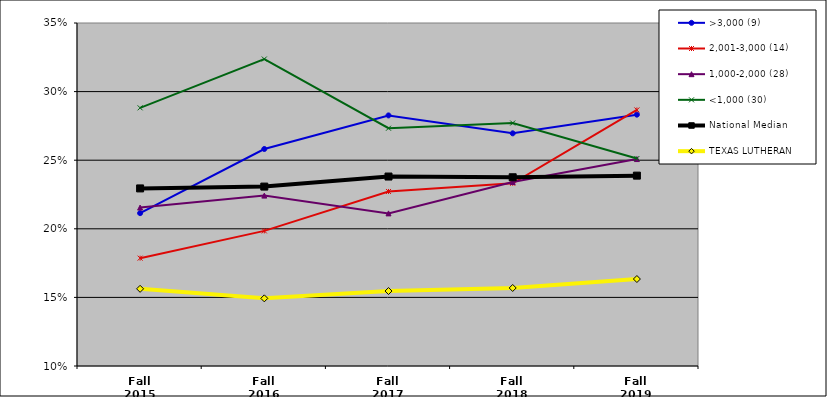
| Category | >3,000 (9) | 2,001-3,000 (14) | 1,000-2,000 (28) | <1,000 (30) | National Median | TEXAS LUTHERAN |
|---|---|---|---|---|---|---|
| Fall 2015 | 0.211 | 0.179 | 0.215 | 0.288 | 0.229 | 0.156 |
| Fall 2016 | 0.258 | 0.198 | 0.224 | 0.324 | 0.231 | 0.149 |
| Fall 2017 | 0.283 | 0.227 | 0.211 | 0.273 | 0.238 | 0.155 |
| Fall 2018 | 0.27 | 0.233 | 0.234 | 0.277 | 0.238 | 0.157 |
| Fall 2019 | 0.283 | 0.287 | 0.251 | 0.251 | 0.239 | 0.163 |